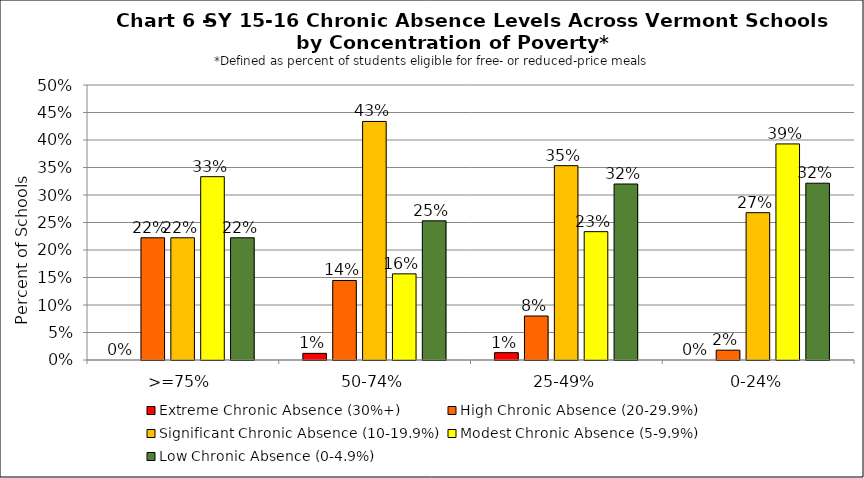
| Category | Extreme Chronic Absence (30%+) | High Chronic Absence (20-29.9%) | Significant Chronic Absence (10-19.9%) | Modest Chronic Absence (5-9.9%) | Low Chronic Absence (0-4.9%) |
|---|---|---|---|---|---|
| 0 | 0 | 0.222 | 0.222 | 0.333 | 0.222 |
| 1 | 0.012 | 0.145 | 0.434 | 0.157 | 0.253 |
| 2 | 0.013 | 0.08 | 0.353 | 0.233 | 0.32 |
| 3 | 0 | 0.018 | 0.268 | 0.393 | 0.321 |